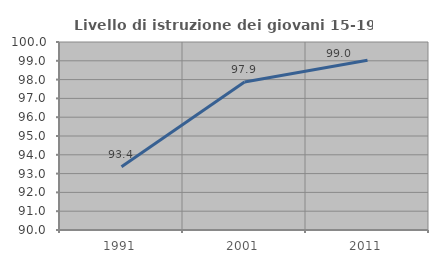
| Category | Livello di istruzione dei giovani 15-19 anni |
|---|---|
| 1991.0 | 93.367 |
| 2001.0 | 97.874 |
| 2011.0 | 99.025 |